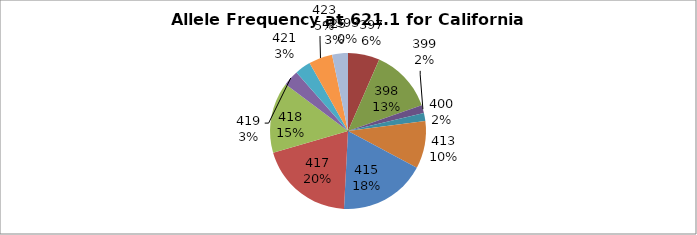
| Category | Series 0 |
|---|---|
| 393.0 | 0 |
| 397.0 | 0.066 |
| 398.0 | 0.131 |
| 399.0 | 0.016 |
| 400.0 | 0.016 |
| 413.0 | 0.098 |
| 415.0 | 0.18 |
| 417.0 | 0.197 |
| 418.0 | 0.148 |
| 419.0 | 0.033 |
| 421.0 | 0.033 |
| 423.0 | 0.049 |
| 425.0 | 0.033 |